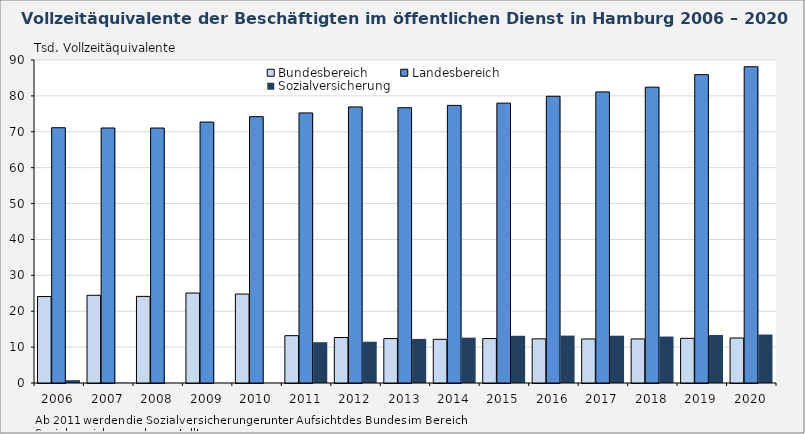
| Category | Bundesbereich | Landesbereich | Sozialversicherung |
|---|---|---|---|
| 2006.0 | 24.091 | 71.132 | 0.792 |
| 2007.0 | 24.443 | 71.054 | 0.075 |
| 2008.0 | 24.137 | 71.045 | 0 |
| 2009.0 | 25.062 | 72.703 | 0 |
| 2010.0 | 24.79 | 74.216 | 0 |
| 2011.0 | 13.19 | 75.256 | 11.372 |
| 2012.0 | 12.669 | 76.923 | 11.495 |
| 2013.0 | 12.379 | 76.705 | 12.284 |
| 2014.0 | 12.173 | 77.353 | 12.643 |
| 2015.0 | 12.39 | 77.981 | 13.156 |
| 2016.0 | 12.303 | 79.896 | 13.21 |
| 2017.0 | 12.272 | 81.109 | 13.178 |
| 2018.0 | 12.278 | 82.429 | 12.946 |
| 2019.0 | 12.448 | 85.922 | 13.384 |
| 2020.0 | 12.535 | 88.115 | 13.505 |